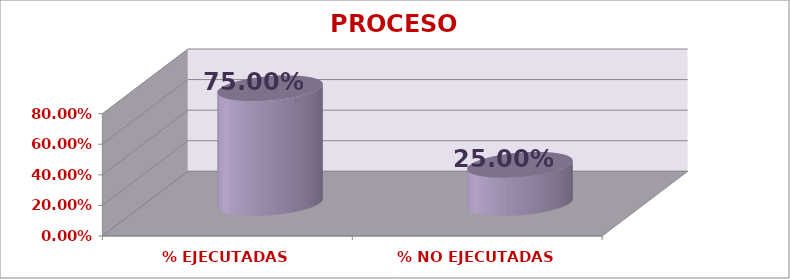
| Category | PROCESO ACCESIBILIDAD |
|---|---|
| % EJECUTADAS | 0.75 |
| % NO EJECUTADAS | 0.25 |